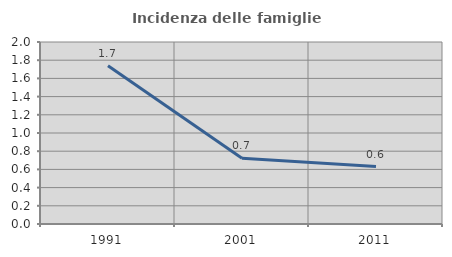
| Category | Incidenza delle famiglie numerose |
|---|---|
| 1991.0 | 1.739 |
| 2001.0 | 0.722 |
| 2011.0 | 0.631 |